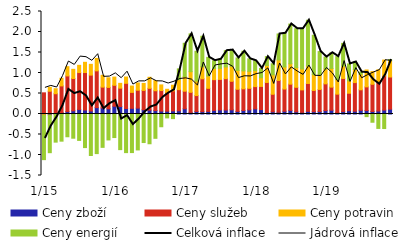
| Category | Ceny zboží | Ceny služeb | Ceny potravin | Ceny energií |
|---|---|---|---|---|
|  1/15 | -0.019 | 0.516 | -0.016 | -1.079 |
| 2 | -0.027 | 0.556 | 0.095 | -0.917 |
| 3 | -0.003 | 0.494 | 0.122 | -0.684 |
| 4 | 0.037 | 0.649 | 0.186 | -0.662 |
| 5 | 0.058 | 0.871 | 0.226 | -0.555 |
| 6 | 0.079 | 0.787 | 0.224 | -0.591 |
| 7 | 0.111 | 0.9 | 0.176 | -0.644 |
| 8 | 0.098 | 0.915 | 0.249 | -0.819 |
| 9 | 0.074 | 0.875 | 0.263 | -1.012 |
| 10 | 0.155 | 0.898 | 0.303 | -0.966 |
| 11 | 0.147 | 0.509 | 0.287 | -0.813 |
| 12 | 0.126 | 0.522 | 0.234 | -0.632 |
|  1/16 | 0.19 | 0.51 | 0.2 | -0.574 |
| 2 | 0.183 | 0.447 | 0.117 | -0.869 |
| 3 | 0.134 | 0.614 | 0.153 | -0.942 |
| 4 | 0.139 | 0.389 | 0.155 | -0.941 |
| 5 | 0.144 | 0.436 | 0.178 | -0.876 |
| 6 | 0.104 | 0.471 | 0.17 | -0.696 |
| 7 | 0.095 | 0.532 | 0.269 | -0.726 |
| 8 | 0.084 | 0.483 | 0.245 | -0.593 |
| 9 | 0.071 | 0.502 | 0.137 | -0.311 |
| 10 | 0.068 | 0.458 | 0.076 | -0.095 |
| 11 | 0.076 | 0.489 | 0.138 | -0.112 |
| 12 | 0.079 | 0.515 | 0.246 | 0.26 |
|  1/17 | 0.128 | 0.428 | 0.357 | 0.811 |
| 2 | 0.04 | 0.489 | 0.504 | 0.922 |
| 3 | 0.06 | 0.389 | 0.354 | 0.727 |
| 4 | 0.058 | 0.801 | 0.292 | 0.745 |
| 5 | 0.063 | 0.564 | 0.301 | 0.454 |
| 6 | 0.089 | 0.749 | 0.273 | 0.189 |
| 7 | 0.1 | 0.744 | 0.271 | 0.222 |
| 8 | 0.097 | 0.765 | 0.286 | 0.396 |
| 9 | 0.102 | 0.696 | 0.365 | 0.396 |
| 10 | 0.062 | 0.541 | 0.46 | 0.304 |
| 11 | 0.086 | 0.528 | 0.438 | 0.479 |
| 12 | 0.101 | 0.525 | 0.414 | 0.304 |
|  1/18 | 0.126 | 0.543 | 0.39 | 0.238 |
| 2 | 0.107 | 0.566 | 0.211 | 0.229 |
| 3 | 0.034 | 0.736 | 0.415 | 0.215 |
| 4 | 0.054 | 0.428 | 0.474 | 0.269 |
| 5 | 0.044 | 0.775 | 0.499 | 0.633 |
| 6 | 0.067 | 0.543 | 0.537 | 0.822 |
| 7 | 0.088 | 0.64 | 0.497 | 0.97 |
| 8 | 0.054 | 0.597 | 0.48 | 0.949 |
| 9 | 0.041 | 0.547 | 0.511 | 0.983 |
| 10 | 0.064 | 0.681 | 0.428 | 1.113 |
| 11 | 0.057 | 0.518 | 0.385 | 0.959 |
| 12 | 0.062 | 0.538 | 0.349 | 0.573 |
|  1/19 | 0.083 | 0.652 | 0.366 | 0.287 |
| 2 | 0.093 | 0.562 | 0.456 | 0.382 |
| 3 | 0.036 | 0.448 | 0.353 | 0.562 |
| 4 | 0.059 | 0.808 | 0.301 | 0.555 |
| 5 | 0.081 | 0.426 | 0.303 | 0.412 |
| 6 | 0.068 | 0.698 | 0.317 | 0.184 |
| 7 | 0.091 | 0.499 | 0.381 | 0.05 |
| 8 | 0.086 | 0.576 | 0.412 | -0.064 |
| 9 | 0.06 | 0.665 | 0.309 | -0.201 |
| 10 | 0.073 | 0.702 | 0.302 | -0.352 |
| 11 | 0.096 | 0.836 | 0.383 | -0.355 |
| 12 | 0.119 | 0.784 | 0.401 | 0.023 |